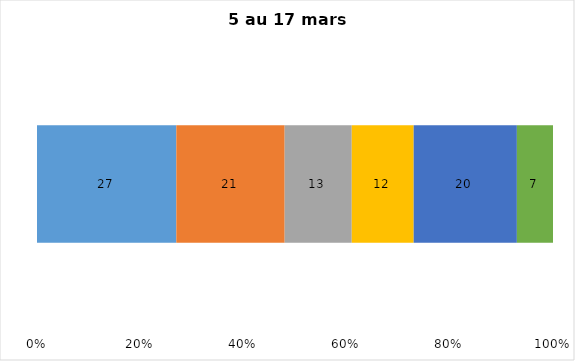
| Category | Plusieurs fois par jour | Une fois par jour | Quelques fois par semaine   | Une fois par semaine ou moins   |  Jamais   |  Je n’utilise pas les médias sociaux |
|---|---|---|---|---|---|---|
| 0 | 27 | 21 | 13 | 12 | 20 | 7 |